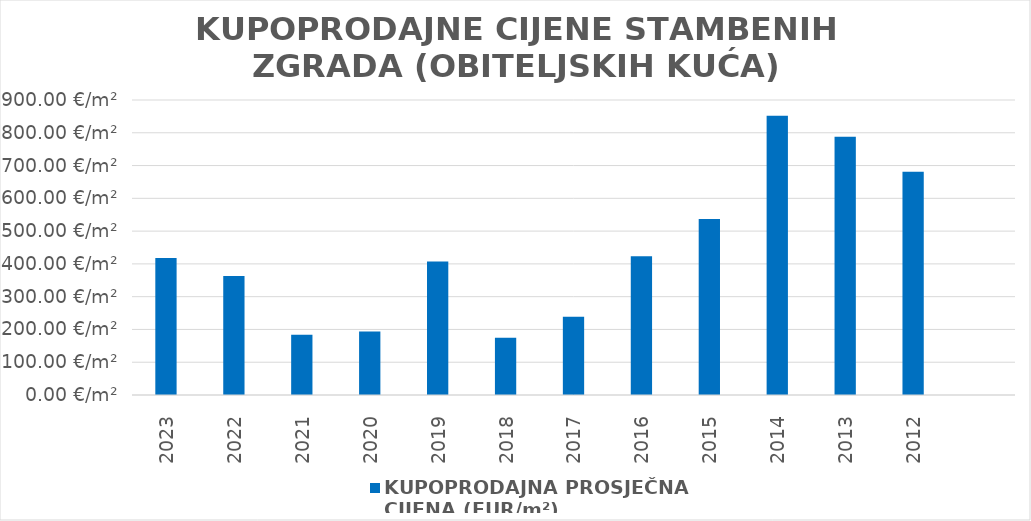
| Category | KUPOPRODAJNA PROSJEČNA 
CIJENA (EUR/m²) |
|---|---|
| 2023 | 1901-02-20 18:31:57 |
| 2022 | 1900-12-28 08:50:08 |
| 2021 | 1900-07-02 03:32:47 |
| 2020 | 1900-07-11 09:16:23 |
| 2019 | 1901-02-10 09:36:29 |
| 2018 | 1900-06-22 08:46:37 |
| 2017 | 1900-08-25 18:43:31 |
| 2016 | 1901-02-26 02:57:46 |
| 2015 | 1901-06-19 23:06:12 |
| 2014 | 1902-04-30 17:21:26 |
| 2013 | 1902-02-26 03:10:04 |
| 2012 | 1901-11-10 20:38:24 |